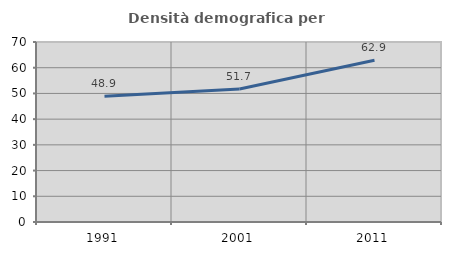
| Category | Densità demografica |
|---|---|
| 1991.0 | 48.86 |
| 2001.0 | 51.747 |
| 2011.0 | 62.913 |